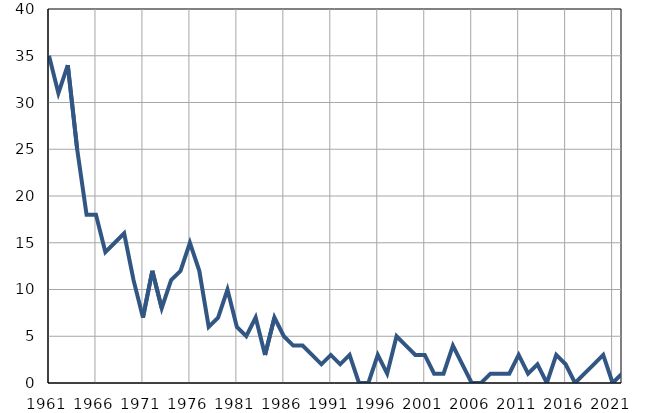
| Category | Умрла 
одојчад |
|---|---|
| 1961.0 | 35 |
| 1962.0 | 31 |
| 1963.0 | 34 |
| 1964.0 | 25 |
| 1965.0 | 18 |
| 1966.0 | 18 |
| 1967.0 | 14 |
| 1968.0 | 15 |
| 1969.0 | 16 |
| 1970.0 | 11 |
| 1971.0 | 7 |
| 1972.0 | 12 |
| 1973.0 | 8 |
| 1974.0 | 11 |
| 1975.0 | 12 |
| 1976.0 | 15 |
| 1977.0 | 12 |
| 1978.0 | 6 |
| 1979.0 | 7 |
| 1980.0 | 10 |
| 1981.0 | 6 |
| 1982.0 | 5 |
| 1983.0 | 7 |
| 1984.0 | 3 |
| 1985.0 | 7 |
| 1986.0 | 5 |
| 1987.0 | 4 |
| 1988.0 | 4 |
| 1989.0 | 3 |
| 1990.0 | 2 |
| 1991.0 | 3 |
| 1992.0 | 2 |
| 1993.0 | 3 |
| 1994.0 | 0 |
| 1995.0 | 0 |
| 1996.0 | 3 |
| 1997.0 | 1 |
| 1998.0 | 5 |
| 1999.0 | 4 |
| 2000.0 | 3 |
| 2001.0 | 3 |
| 2002.0 | 1 |
| 2003.0 | 1 |
| 2004.0 | 4 |
| 2005.0 | 2 |
| 2006.0 | 0 |
| 2007.0 | 0 |
| 2008.0 | 1 |
| 2009.0 | 1 |
| 2010.0 | 1 |
| 2011.0 | 3 |
| 2012.0 | 1 |
| 2013.0 | 2 |
| 2014.0 | 0 |
| 2015.0 | 3 |
| 2016.0 | 2 |
| 2017.0 | 0 |
| 2018.0 | 1 |
| 2019.0 | 2 |
| 2020.0 | 3 |
| 2021.0 | 0 |
| 2022.0 | 1 |